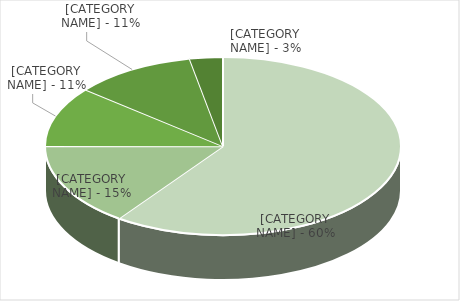
| Category | Series 0 | Series 1 |
|---|---|---|
| Administration Fee | 1997508 | 0.599 |
| WA Dept. of Ecology Grant | 502510 | 0.151 |
| Collection Service Fees | 363816 | 0.109 |
| Disposal Service Fees | 368508 | 0.111 |
| Cost Share / Interest / Recycling | 100000 | 0.03 |